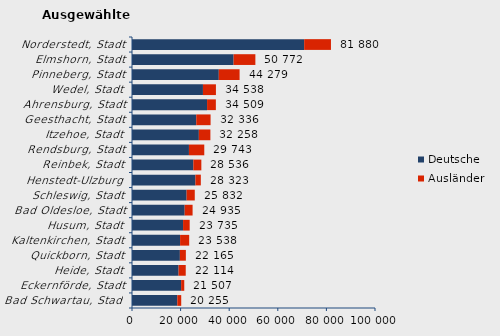
| Category | Deutsche | Ausländer | Series 2 |
|---|---|---|---|
| Bad Schwartau, Stadt | 18644 | 1611 | 20255 |
| Eckernförde, Stadt | 20215 | 1292 | 21507 |
| Heide, Stadt | 19167 | 2947 | 22114 |
| Quickborn, Stadt | 19706 | 2459 | 22165 |
| Kaltenkirchen, Stadt | 19793 | 3745 | 23538 |
| Husum, Stadt | 21013 | 2722 | 23735 |
| Bad Oldesloe, Stadt | 21678 | 3257 | 24935 |
| Schleswig, Stadt | 22473 | 3359 | 25832 |
| Henstedt-Ulzburg | 26093 | 2230 | 28323 |
| Reinbek, Stadt | 25240 | 3296 | 28536 |
| Rendsburg, Stadt | 23435 | 6308 | 29743 |
| Itzehoe, Stadt | 27512 | 4746 | 32258 |
| Geesthacht, Stadt | 26440 | 5896 | 32336 |
| Ahrensburg, Stadt | 30889 | 3620 | 34509 |
| Wedel, Stadt | 29197 | 5341 | 34538 |
| Pinneberg, Stadt | 35722 | 8557 | 44279 |
| Elmshorn, Stadt | 41809 | 8963 | 50772 |
| Norderstedt, Stadt | 70851 | 11029 | 81880 |